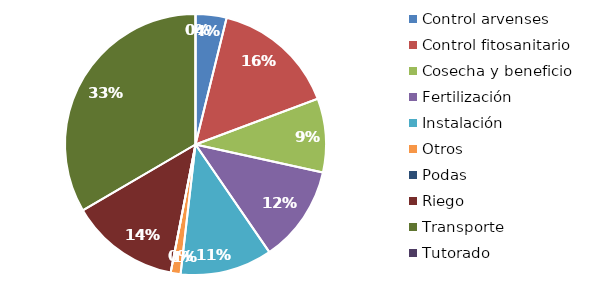
| Category | Valor |
|---|---|
| Control arvenses | 1458850 |
| Control fitosanitario | 5877670 |
| Cosecha y beneficio | 3478609.529 |
| Fertilización | 4554500 |
| Instalación | 4331527.987 |
| Otros | 467036.515 |
| Podas | 0 |
| Riego | 5144020 |
| Transporte | 12703695.6 |
| Tutorado | 0 |